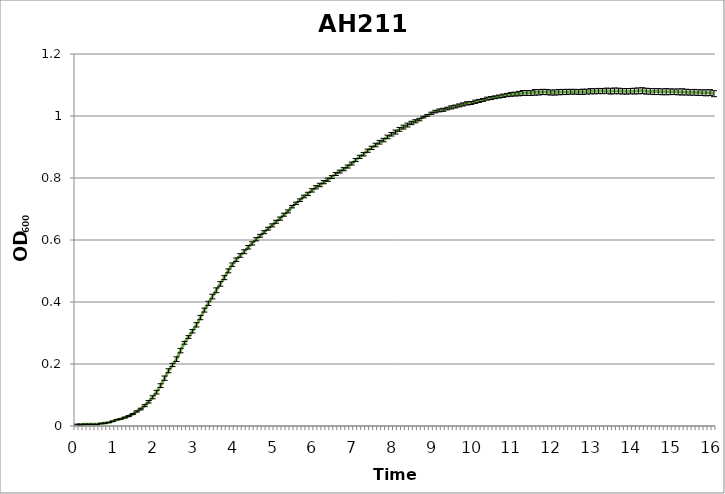
| Category | AH201 LB |
|---|---|
| 0.0 | 0.005 |
| nan | 0.005 |
| nan | 0.006 |
| nan | 0.005 |
| nan | 0.005 |
| nan | 0.005 |
| nan | 0.008 |
| nan | 0.009 |
| nan | 0.011 |
| nan | 0.015 |
| 1.0 | 0.02 |
| nan | 0.023 |
| nan | 0.027 |
| nan | 0.032 |
| nan | 0.038 |
| nan | 0.047 |
| nan | 0.055 |
| nan | 0.066 |
| nan | 0.078 |
| nan | 0.093 |
| 2.0 | 0.109 |
| nan | 0.13 |
| nan | 0.154 |
| nan | 0.178 |
| nan | 0.197 |
| nan | 0.216 |
| nan | 0.243 |
| nan | 0.268 |
| nan | 0.287 |
| nan | 0.306 |
| 3.0 | 0.326 |
| nan | 0.35 |
| nan | 0.374 |
| nan | 0.396 |
| nan | 0.417 |
| nan | 0.438 |
| nan | 0.458 |
| nan | 0.479 |
| nan | 0.5 |
| nan | 0.52 |
| 4.0 | 0.536 |
| nan | 0.55 |
| nan | 0.562 |
| nan | 0.577 |
| nan | 0.589 |
| nan | 0.602 |
| nan | 0.614 |
| nan | 0.625 |
| nan | 0.637 |
| nan | 0.647 |
| 5.0 | 0.659 |
| nan | 0.669 |
| nan | 0.682 |
| nan | 0.692 |
| nan | 0.708 |
| nan | 0.718 |
| nan | 0.728 |
| nan | 0.74 |
| nan | 0.749 |
| nan | 0.76 |
| 6.0 | 0.77 |
| nan | 0.777 |
| nan | 0.787 |
| nan | 0.795 |
| nan | 0.803 |
| nan | 0.813 |
| nan | 0.821 |
| nan | 0.828 |
| nan | 0.837 |
| nan | 0.847 |
| 7.0 | 0.858 |
| nan | 0.868 |
| nan | 0.877 |
| nan | 0.888 |
| nan | 0.897 |
| nan | 0.906 |
| nan | 0.915 |
| nan | 0.922 |
| nan | 0.932 |
| nan | 0.941 |
| 8.0 | 0.948 |
| nan | 0.957 |
| nan | 0.964 |
| nan | 0.971 |
| nan | 0.978 |
| nan | 0.983 |
| nan | 0.988 |
| nan | 0.997 |
| nan | 1.002 |
| nan | 1.009 |
| 9.0 | 1.014 |
| nan | 1.018 |
| nan | 1.02 |
| nan | 1.024 |
| nan | 1.028 |
| nan | 1.031 |
| nan | 1.034 |
| nan | 1.037 |
| nan | 1.041 |
| nan | 1.042 |
| 10.0 | 1.046 |
| nan | 1.049 |
| nan | 1.052 |
| nan | 1.056 |
| nan | 1.058 |
| nan | 1.06 |
| nan | 1.063 |
| nan | 1.065 |
| nan | 1.068 |
| nan | 1.07 |
| 11.0 | 1.071 |
| nan | 1.072 |
| nan | 1.074 |
| nan | 1.074 |
| nan | 1.074 |
| nan | 1.076 |
| nan | 1.076 |
| nan | 1.078 |
| nan | 1.077 |
| nan | 1.076 |
| 12.0 | 1.076 |
| nan | 1.077 |
| nan | 1.077 |
| nan | 1.078 |
| nan | 1.078 |
| nan | 1.078 |
| nan | 1.077 |
| nan | 1.078 |
| nan | 1.079 |
| nan | 1.08 |
| 13.0 | 1.08 |
| nan | 1.081 |
| nan | 1.08 |
| nan | 1.082 |
| nan | 1.08 |
| nan | 1.081 |
| nan | 1.081 |
| nan | 1.08 |
| nan | 1.08 |
| nan | 1.08 |
| 14.0 | 1.08 |
| nan | 1.081 |
| nan | 1.082 |
| nan | 1.08 |
| nan | 1.079 |
| nan | 1.079 |
| nan | 1.079 |
| nan | 1.078 |
| nan | 1.078 |
| nan | 1.078 |
| 15.0 | 1.078 |
| nan | 1.078 |
| nan | 1.078 |
| nan | 1.077 |
| nan | 1.076 |
| nan | 1.076 |
| nan | 1.076 |
| nan | 1.075 |
| nan | 1.075 |
| nan | 1.075 |
| 16.0 | 1.072 |